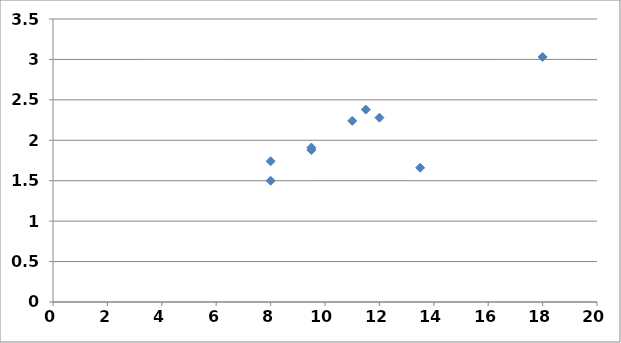
| Category | Market-to-Book |
|---|---|
| 13.5 | 1.66 |
| 9.5 | 1.88 |
| 8.0 | 1.5 |
| 18.0 | 3.03 |
| 8.0 | 1.74 |
| 11.5 | 2.38 |
| 12.0 | 2.28 |
| 9.5 | 1.91 |
| 11.0 | 2.24 |